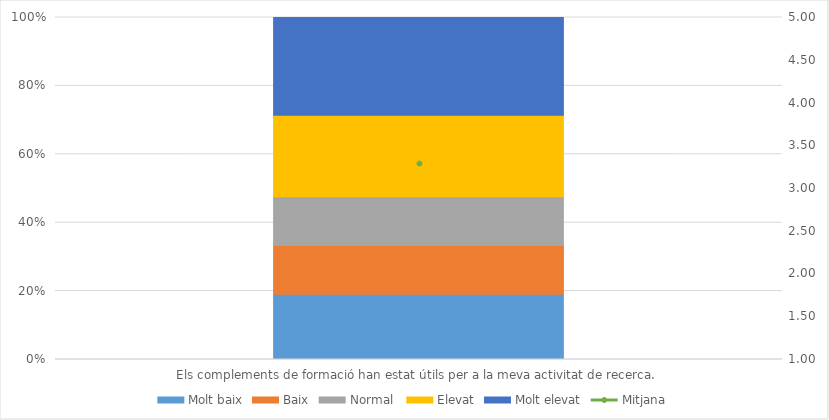
| Category | Molt baix | Baix | Normal  | Elevat | Molt elevat |
|---|---|---|---|---|---|
| Els complements de formació han estat útils per a la meva activitat de recerca. | 4 | 3 | 3 | 5 | 6 |